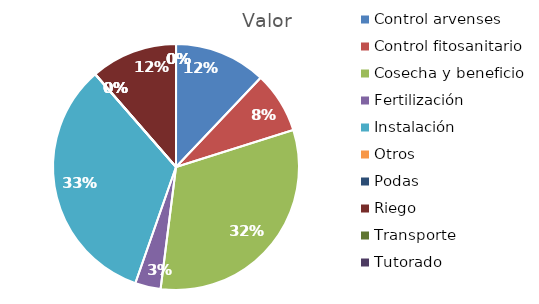
| Category | Valor |
|---|---|
| Control arvenses | 1018782 |
| Control fitosanitario | 679188 |
| Cosecha y beneficio | 2688473 |
| Fertilización | 282995 |
| Instalación | 2803455 |
| Otros | 0 |
| Podas | 0 |
| Riego | 962183 |
| Transporte | 0 |
| Tutorado | 0 |